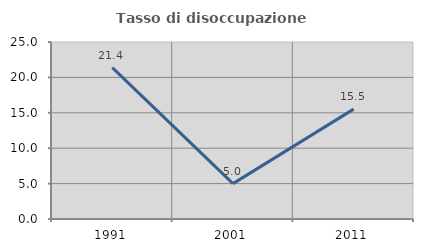
| Category | Tasso di disoccupazione giovanile  |
|---|---|
| 1991.0 | 21.379 |
| 2001.0 | 5 |
| 2011.0 | 15.517 |